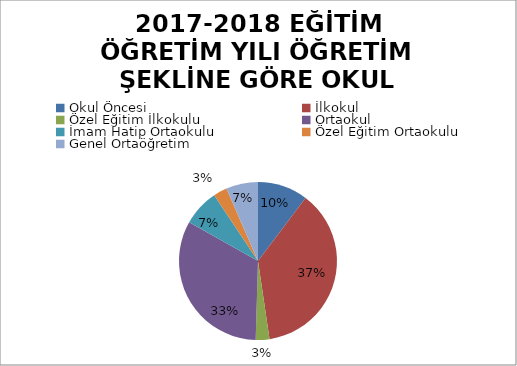
| Category | Series 0 |
|---|---|
| Okul Öncesi | 11 |
| İlkokul | 40 |
| Özel Eğitim İlkokulu | 3 |
| Ortaokul | 35 |
| İmam Hatip Ortaokulu | 8 |
| Özel Eğitim Ortaokulu  | 3 |
| Genel Ortaöğretim  | 7 |